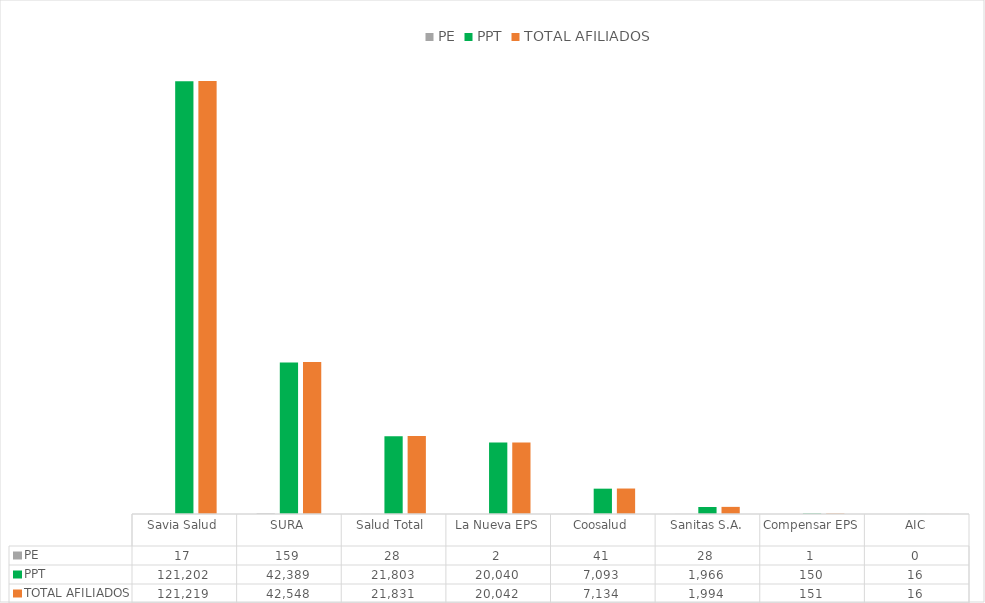
| Category | PE | PPT | TOTAL AFILIADOS |
|---|---|---|---|
| Savia Salud | 17 | 121202 | 121219 |
| SURA | 159 | 42389 | 42548 |
| Salud Total  | 28 | 21803 | 21831 |
| La Nueva EPS | 2 | 20040 | 20042 |
| Coosalud | 41 | 7093 | 7134 |
| Sanitas S.A. | 28 | 1966 | 1994 |
| Compensar EPS | 1 | 150 | 151 |
| AIC | 0 | 16 | 16 |